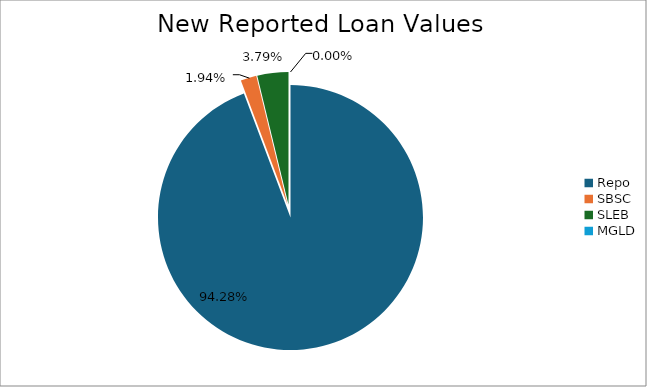
| Category | Series 0 |
|---|---|
| Repo | 11525714.583 |
| SBSC | 236626.954 |
| SLEB | 463098.294 |
| MGLD | 22.451 |